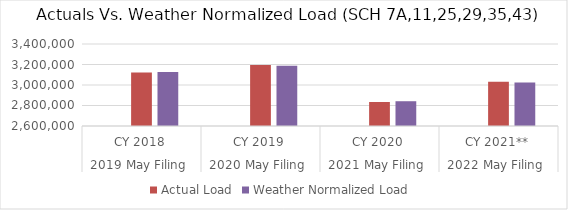
| Category | Residential: SCH 7 | Actual Load | Weather Normalized Load  |
|---|---|---|---|
| 0 |  | 3122610.451 | 3126323.091 |
| 1 |  | 3195389.244 | 3187237.095 |
| 2 |  | 2834450.378 | 2841684.948 |
| 3 |  | 3031552.024 | 3023241.606 |